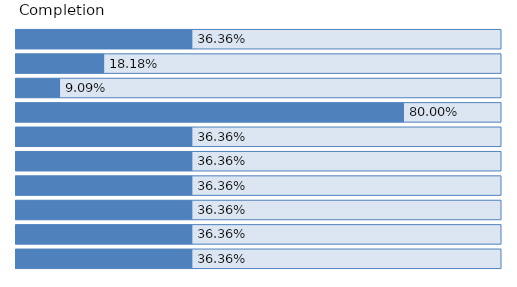
| Category | Series 0 | Series 1 |
|---|---|---|
| 0 | 0.364 | 1 |
| 1 | 0.182 | 1 |
| 2 | 0.091 | 1 |
| 3 | 0.8 | 1 |
| 4 | 0.364 | 1 |
| 5 | 0.364 | 1 |
| 6 | 0.364 | 1 |
| 7 | 0.364 | 1 |
| 8 | 0.364 | 1 |
| 9 | 0.364 | 1 |